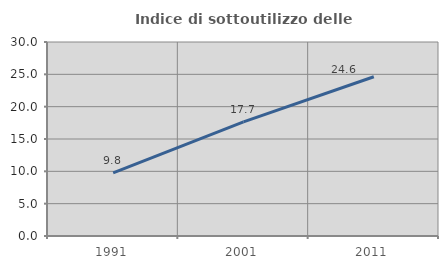
| Category | Indice di sottoutilizzo delle abitazioni  |
|---|---|
| 1991.0 | 9.758 |
| 2001.0 | 17.66 |
| 2011.0 | 24.622 |